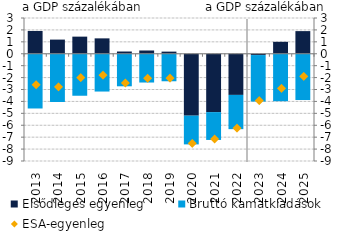
| Category | Elsődleges egyenleg | Bruttó kamatkiadások |
|---|---|---|
| 2013.0 | 1.912 | -4.51 |
| 2014.0 | 1.188 | -3.963 |
| 2015.0 | 1.436 | -3.44 |
| 2016.0 | 1.291 | -3.088 |
| 2017.0 | 0.188 | -2.647 |
| 2018.0 | 0.274 | -2.331 |
| 2019.0 | 0.178 | -2.225 |
| 2020.0 | -5.195 | -2.327 |
| 2021.0 | -4.899 | -2.25 |
| 2022.0 | -3.454 | -2.79 |
| 2023.0 | -0.11 | -3.817 |
| 2024.0 | 1 | -3.9 |
| 2025.0 | 1.9 | -3.8 |